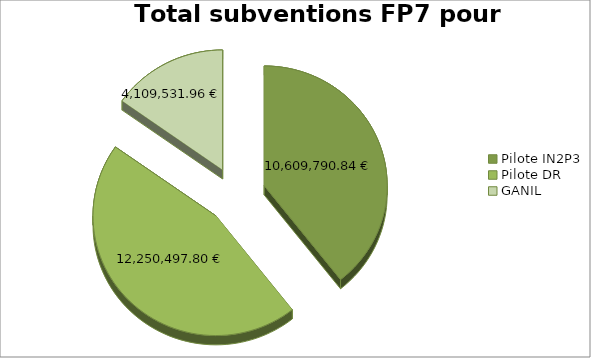
| Category | Fin. FP7 |
|---|---|
| Pilote IN2P3 | 10609790.84 |
| Pilote DR | 12250497.8 |
| GANIL | 4109531.96 |